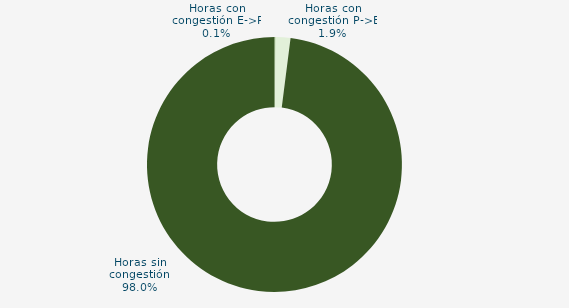
| Category | Horas con congestión E->P |
|---|---|
| Horas con congestión E->P | 0.144 |
| Horas con congestión P->E | 1.868 |
| Horas sin congestión | 97.989 |